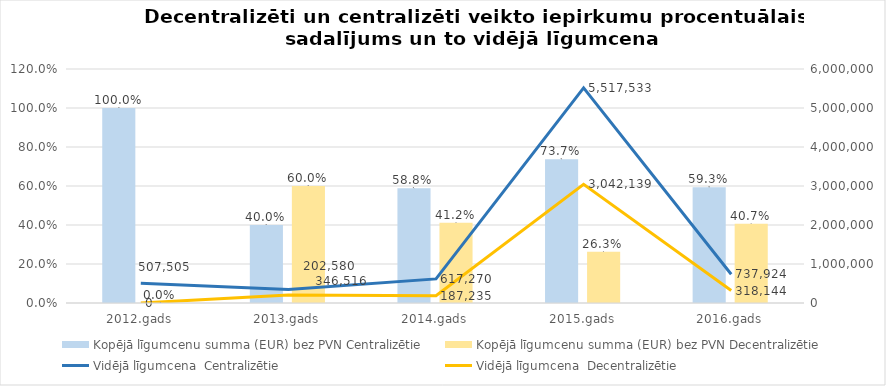
| Category | Kopējā līgumcenu summa (EUR) bez PVN |
|---|---|
| 2012.gads | 0 |
| 2013.gads | 0.6 |
| 2014.gads | 0.412 |
| 2015.gads | 0.263 |
| 2016.gads | 0.407 |